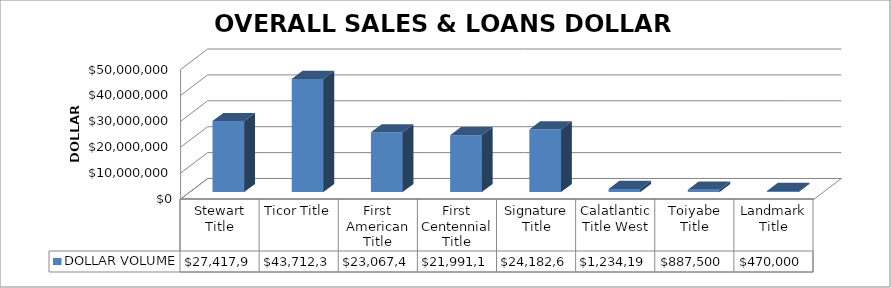
| Category | DOLLAR VOLUME |
|---|---|
| Stewart Title | 27417934 |
| Ticor Title | 43712360 |
| First American Title | 23067450 |
| First Centennial Title | 21991142.5 |
| Signature Title | 24182684 |
| Calatlantic Title West | 1234190 |
| Toiyabe Title | 887500 |
| Landmark Title | 470000 |